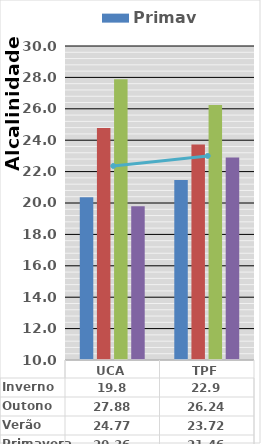
| Category | Primavera | Verão | Outono | Inverno |
|---|---|---|---|---|
| UCA | 20.36 | 24.77 | 27.88 | 19.8 |
| TPF | 21.46 | 23.72 | 26.24 | 22.9 |